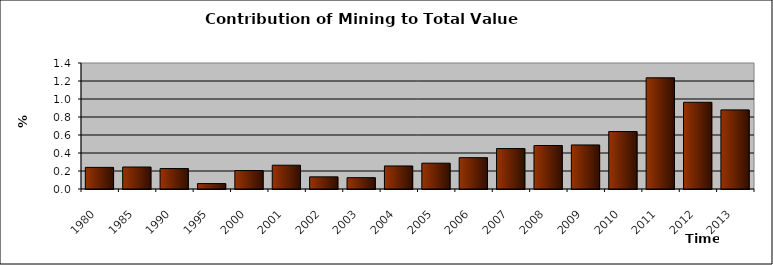
| Category | Series 0 |
|---|---|
| 1980.0 | 0.24 |
| 1985.0 | 0.244 |
| 1990.0 | 0.227 |
| 1995.0 | 0.06 |
| 2000.0 | 0.205 |
| 2001.0 | 0.264 |
| 2002.0 | 0.135 |
| 2003.0 | 0.126 |
| 2004.0 | 0.256 |
| 2005.0 | 0.287 |
| 2006.0 | 0.348 |
| 2007.0 | 0.449 |
| 2008.0 | 0.483 |
| 2009.0 | 0.49 |
| 2010.0 | 0.638 |
| 2011.0 | 1.236 |
| 2012.0 | 0.963 |
| 2013.0 | 0.879 |